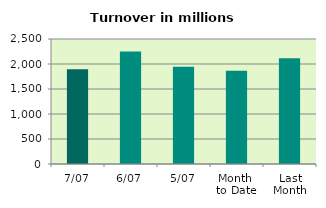
| Category | Series 0 |
|---|---|
| 7/07 | 1894.215 |
| 6/07 | 2249.895 |
| 5/07 | 1944.19 |
| Month 
to Date | 1866.354 |
| Last
Month | 2115.436 |